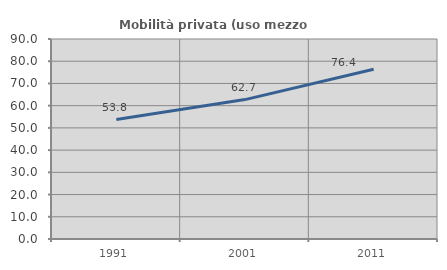
| Category | Mobilità privata (uso mezzo privato) |
|---|---|
| 1991.0 | 53.756 |
| 2001.0 | 62.736 |
| 2011.0 | 76.398 |